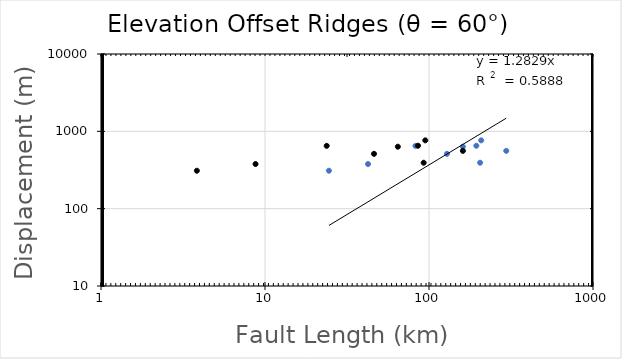
| Category | Series 0 |
|---|---|
| 194.37219 | 651.251 |
| 160.96145 | 632.776 |
| 295.86716 | 558.875 |
| 128.75893 | 511.532 |
| 204.93876 | 392.598 |
| 42.480362 | 377.587 |
| 24.528901 | 309.46 |
| 208.12885 | 764.412 |
| 82.697588 | 648.942 |